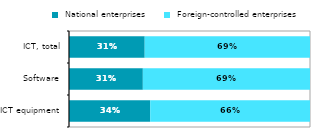
| Category |  National enterprises |  Foreign-controlled enterprises |
|---|---|---|
| ICT equipment | 0.337 | 0.663 |
| Software | 0.306 | 0.694 |
| ICT, total | 0.314 | 0.686 |